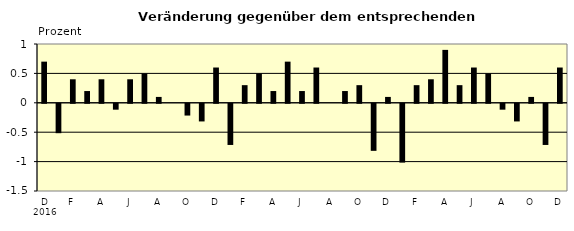
| Category | Series 0 |
|---|---|
| 0 | 0.7 |
| 1 | -0.5 |
| 2 | 0.4 |
| 3 | 0.2 |
| 4 | 0.4 |
| 5 | -0.1 |
| 6 | 0.4 |
| 7 | 0.5 |
| 8 | 0.1 |
| 9 | 0 |
| 10 | -0.2 |
| 11 | -0.3 |
| 12 | 0.6 |
| 13 | -0.7 |
| 14 | 0.3 |
| 15 | 0.5 |
| 16 | 0.2 |
| 17 | 0.7 |
| 18 | 0.2 |
| 19 | 0.6 |
| 20 | 0 |
| 21 | 0.2 |
| 22 | 0.3 |
| 23 | -0.8 |
| 24 | 0.1 |
| 25 | -1 |
| 26 | 0.3 |
| 27 | 0.4 |
| 28 | 0.9 |
| 29 | 0.3 |
| 30 | 0.6 |
| 31 | 0.5 |
| 32 | -0.1 |
| 33 | -0.3 |
| 34 | 0.1 |
| 35 | -0.7 |
| 36 | 0.6 |